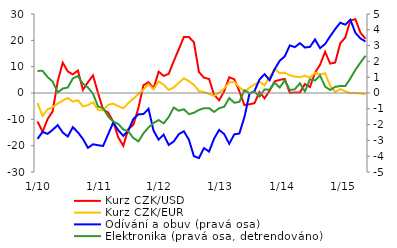
| Category | Kurz CZK/USD  | Kurz CZK/EUR  |
|---|---|---|
|  1/10 | -10.819 | -3.803 |
| 2 | -14.734 | -8.722 |
| 3 | -9.884 | -6.202 |
| 4 | -6.995 | -5.408 |
| 5 | 4.415 | -4.01 |
| 6 | 11.518 | -2.883 |
| 7 | 8.178 | -1.868 |
| 8 | 7.054 | -3.28 |
| 9 | 8.533 | -2.752 |
| 10 | 1.183 | -5.072 |
| 11 | 4.148 | -4.609 |
| 12 | 6.662 | -3.494 |
|  1/11 | -0.03 | -6.453 |
| 2 | -6.295 | -6.545 |
| 3 | -7.426 | -4.496 |
| 4 | -10.894 | -4.036 |
| 5 | -16.816 | -4.999 |
| 6 | -20.074 | -5.8 |
| 7 | -13.691 | -3.811 |
| 8 | -12.066 | -2.155 |
| 9 | -5.648 | -0.382 |
| 10 | 2.958 | 1.313 |
| 11 | 4.114 | 3.314 |
| 12 | 1.772 | 1.39 |
|  1/12 | 8.082 | 4.428 |
| 2 | 6.478 | 3.151 |
| 3 | 7.28 | 1.163 |
| 4 | 12.081 | 2.09 |
| 5 | 16.622 | 3.851 |
| 6 | 21.271 | 5.583 |
| 7 | 21.302 | 4.49 |
| 8 | 19.252 | 3.081 |
| 9 | 7.922 | 0.709 |
| 10 | 5.82 | 0.363 |
| 11 | 5.323 | -0.346 |
| 12 | -0.697 | -1.17 |
|  1/13 | -2.775 | 0.122 |
| 2 | 0.711 | 1.738 |
| 3 | 5.955 | 3.996 |
| 4 | 5.242 | 4.199 |
| 5 | 0.658 | 2.242 |
| 6 | -4.582 | 0.467 |
| 7 | -4.295 | 2.025 |
| 8 | -3.867 | 3.187 |
| 9 | 0.387 | 4.269 |
| 10 | -2.047 | 2.887 |
| 11 | 0.91 | 6.151 |
| 12 | 4.413 | 9.124 |
|   1/14 | 4.979 | 7.516 |
| 2 | 5.353 | 7.718 |
| 3 | 0.061 | 6.748 |
| 4 | 0.189 | 6.23 |
| 5 | 0.223 | 5.989 |
| 6 | 3.397 | 6.561 |
| 7 | 2.282 | 5.812 |
| 8 | 7.684 | 7.74 |
| 9 | 10.727 | 7.021 |
| 10 | 15.627 | 7.489 |
| 11 | 11.162 | 2.749 |
| 12 | 11.56 | 0.424 |
|   1/15 | 18.9 | 1.496 |
| 2 | 21.051 | 0.604 |
| 3 | 27.504 | -0.054 |
| 4 | 28.034 | -0.025 |
| 5 | 22.92 | -0.161 |
| 6 | 20.599 | -0.528 |